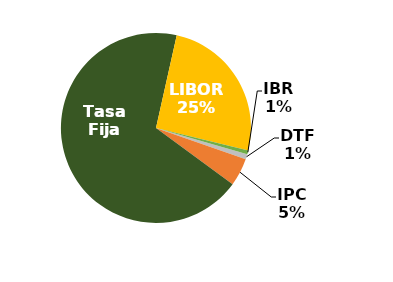
| Category | Series 0 |
|---|---|
| DTF | 0.009 |
| IPC | 0.047 |
| Tasa Fija | 0.684 |
| LIBOR | 0.253 |
| IBR | 0.006 |